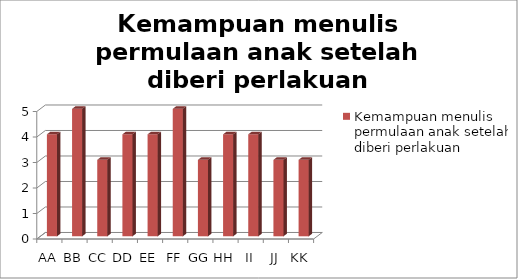
| Category | Kemampuan menulis permulaan anak setelah diberi perlakuan |
|---|---|
| AA | 4 |
| BB | 5 |
| CC | 3 |
| DD | 4 |
| EE | 4 |
| FF | 5 |
| GG | 3 |
| HH | 4 |
| II | 4 |
| JJ | 3 |
| KK | 3 |